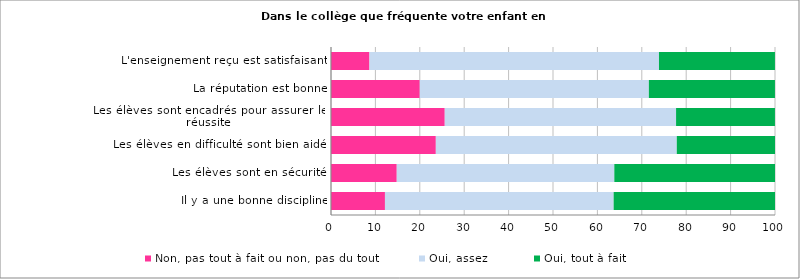
| Category | Non, pas tout à fait ou non, pas du tout  | Oui, assez | Oui, tout à fait |
|---|---|---|---|
| Il y a une bonne discipline | 12.15 | 51.51 | 36.34 |
| Les élèves sont en sécurité  | 14.81 | 49 | 36.19 |
| Les élèves en difficulté sont bien aidés | 23.61 | 54.27 | 22.12 |
| Les élèves sont encadrés pour assurer leur réussite | 25.62 | 52.1 | 22.27 |
| La réputation est bonne | 19.99 | 51.6 | 28.4 |
| L'enseignement reçu est satisfaisant  | 8.66 | 65.21 | 26.12 |